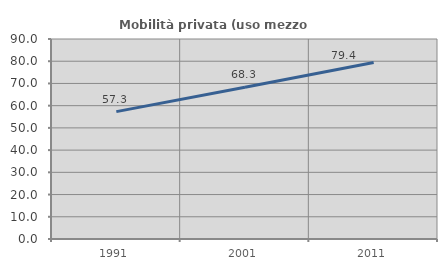
| Category | Mobilità privata (uso mezzo privato) |
|---|---|
| 1991.0 | 57.311 |
| 2001.0 | 68.281 |
| 2011.0 | 79.406 |